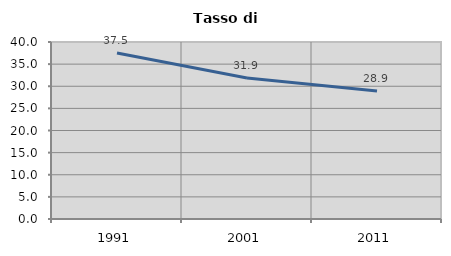
| Category | Tasso di disoccupazione   |
|---|---|
| 1991.0 | 37.5 |
| 2001.0 | 31.879 |
| 2011.0 | 28.918 |